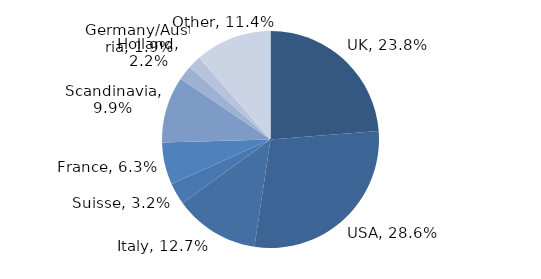
| Category | Investment Style |
|---|---|
| UK | 0.238 |
| USA | 0.286 |
| Italy | 0.127 |
| Suisse | 0.032 |
| France | 0.063 |
| Scandinavia | 0.099 |
| Holland | 0.022 |
| Germany/Austria | 0.019 |
| Other | 0.114 |